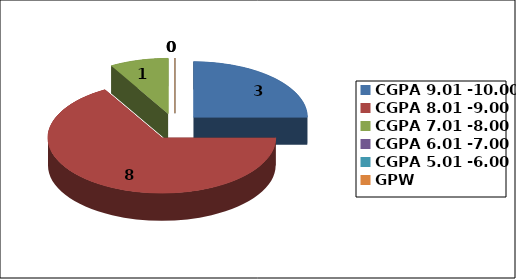
| Category | Series 0 |
|---|---|
| CGPA 9.01 -10.00 | 3 |
| CGPA 8.01 -9.00 | 8 |
| CGPA 7.01 -8.00 | 1 |
| CGPA 6.01 -7.00 | 0 |
| CGPA 5.01 -6.00 | 0 |
| GPW | 0 |